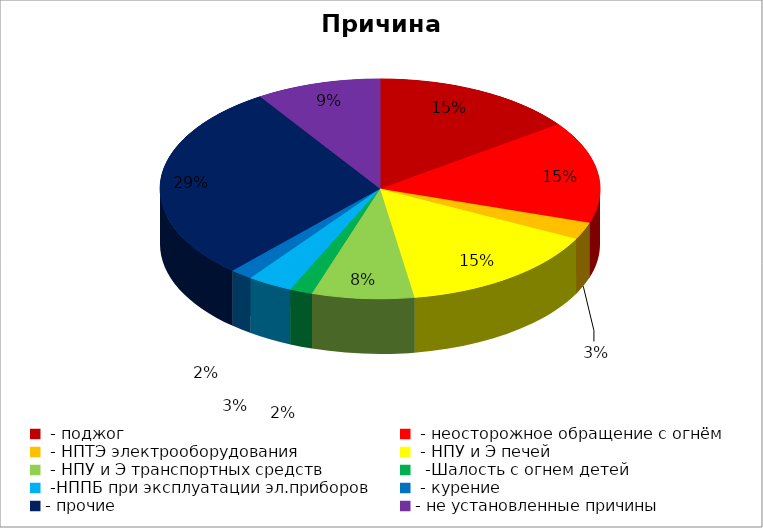
| Category | Причина пожара |
|---|---|
|  - поджог | 18 |
|  - неосторожное обращение с огнём | 18 |
|  - НПТЭ электрооборудования | 3 |
|  - НПУ и Э печей | 18 |
|  - НПУ и Э транспортных средств | 9 |
|   -Шалость с огнем детей | 2 |
|  -НППБ при эксплуатации эл.приборов | 4 |
|  - курение | 2 |
| - прочие | 35 |
| - не установленные причины | 11 |